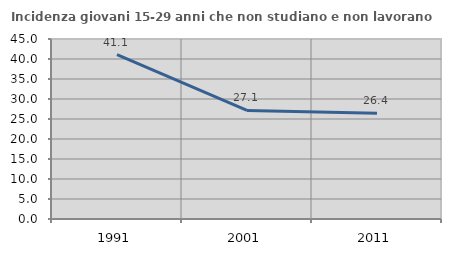
| Category | Incidenza giovani 15-29 anni che non studiano e non lavorano  |
|---|---|
| 1991.0 | 41.099 |
| 2001.0 | 27.144 |
| 2011.0 | 26.438 |